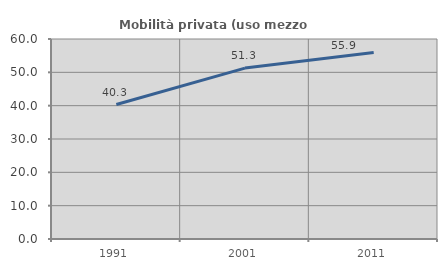
| Category | Mobilità privata (uso mezzo privato) |
|---|---|
| 1991.0 | 40.331 |
| 2001.0 | 51.276 |
| 2011.0 | 55.946 |